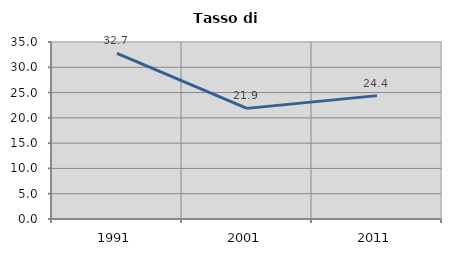
| Category | Tasso di disoccupazione   |
|---|---|
| 1991.0 | 32.74 |
| 2001.0 | 21.875 |
| 2011.0 | 24.397 |